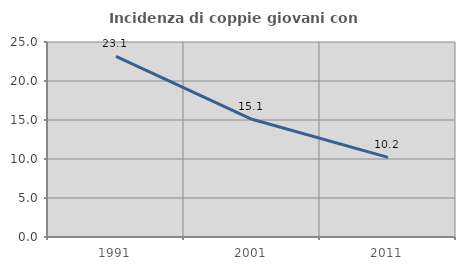
| Category | Incidenza di coppie giovani con figli |
|---|---|
| 1991.0 | 23.148 |
| 2001.0 | 15.094 |
| 2011.0 | 10.204 |